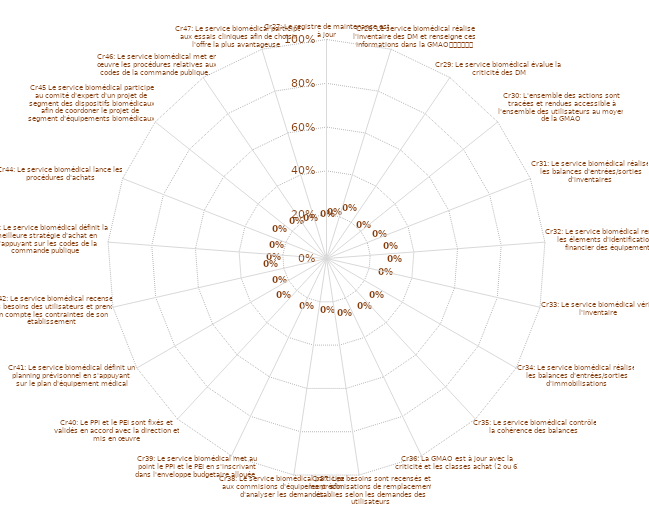
| Category | Graphes RADAR pour Résultats Globaux BPR |
|---|---|
| Cr27: Le registre de maintenance est à jour | 0 |
| Cr28: Le service biomédical réalise l'inventaire des DM et renseigne ces informations dans la GMAO						 | 0 |
| Cr29: Le service biomédical évalue la criticité des DM | 0 |
| Cr30: L'ensemble des actions sont tracées et rendues accessible à l'ensemble des utilisateurs au moyen de la GMAO | 0 |
| Cr31: Le service biomédical réalise les balances d'entrées/sorties d'inventaires | 0 |
| Cr32: Le service biomédical renseigne les élements d'identification et financier des équipements | 0 |
| Cr33: Le service biomédical vérifie l'inventaire  | 0 |
| Cr34: Le service biomédical réalise les balances d'entrées/sorties d'immobilisations | 0 |
| Cr35: Le service biomédical contrôle la cohérence des balances  | 0 |
| Cr36: La GMAO est à jour avec la criticité et les classes achat (2 ou 6). | 0 |
| Cr37: Les besoins sont recensés et les préconisations de remplacement établies selon les demandes des utilisateurs | 0 |
| Cr38: Le service biomédical participe aux commisions d'équipement  afin d'analyser les demandes | 0 |
| Cr39: Le service biomédical met au point le PPI et le PEI en s'inscrivant dans l'enveloppe budgetaire allouée | 0 |
| Cr40: Le PPI et le PEI sont fixés et validés en accord avec la direction et mis en œuvre | 0 |
| Cr41: Le service biomédical définit un planning prévisonnel en s'appuyant sur le plan d'équipement médical | 0 |
| Cr42: Le service biomédical recense les besoins des utilisateurs et prend en compte les contraintes de son établissement | 0 |
| Cr43: Le service biomédical définit la meilleure stratégie d'achat en s'appuyant sur les codes de la commande publique | 0 |
| Cr44: Le service biomédical lance les procédures d'achats | 0 |
| Cr45 Le service biomédical participe au comité d'expert d'un projet de segment des dispositifs biomédicaux afin de coordoner le projet de segment d'équipements biomédicaux | 0 |
| Cr46: Le service biomédical met en œuvre les procédures relatives aux codes de la commande publique.  | 0 |
| Cr47: Le service biomédical participe aux essais cliniques afin de choisir l'offre la plus avantageuse  | 0 |